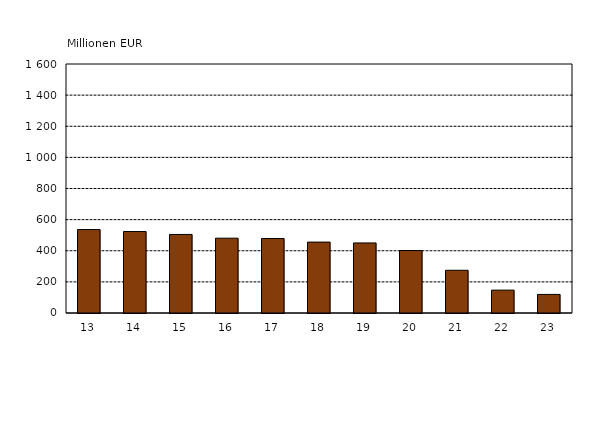
| Category | Series 0 |
|---|---|
| 13 | 536.269 |
| 14 | 523.434 |
| 15 | 504.728 |
| 16 | 480.774 |
| 17 | 478.758 |
| 18 | 455.618 |
| 19 | 450.203 |
| 20 | 401.33 |
| 21 | 274.545 |
| 22 | 147.05 |
| 23 | 119.447 |